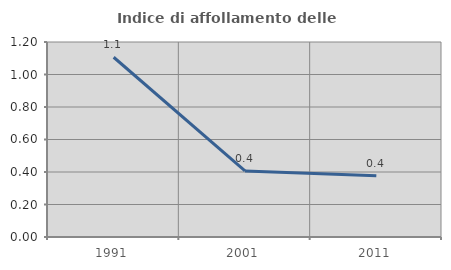
| Category | Indice di affollamento delle abitazioni  |
|---|---|
| 1991.0 | 1.106 |
| 2001.0 | 0.407 |
| 2011.0 | 0.376 |